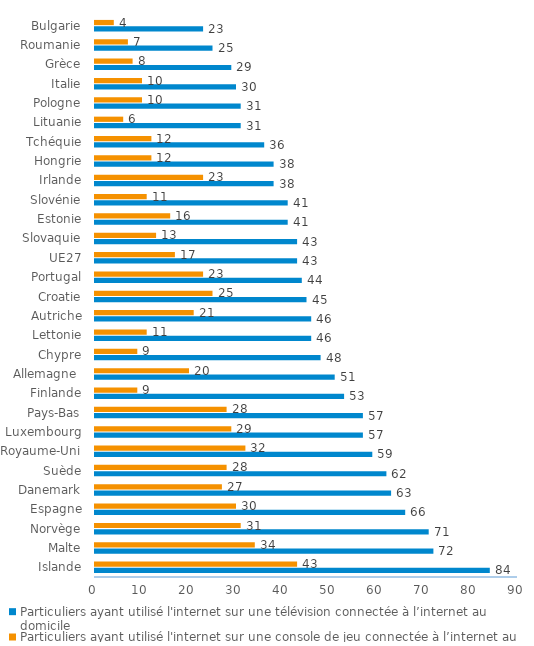
| Category | Particuliers ayant utilisé l'internet sur une télévision connectée à l’internet au domicile | Particuliers ayant utilisé l'internet sur une console de jeu connectée à l’internet au domicile |
|---|---|---|
| Islande | 84 | 43 |
| Malte | 72 | 34 |
| Norvège | 71 | 31 |
| Espagne | 66 | 30 |
| Danemark | 63 | 27 |
| Suède | 62 | 28 |
| Royaume-Uni | 59 | 32 |
| Luxembourg | 57 | 29 |
| Pays-Bas | 57 | 28 |
| Finlande | 53 | 9 |
| Allemagne  | 51 | 20 |
| Chypre | 48 | 9 |
| Lettonie | 46 | 11 |
| Autriche | 46 | 21 |
| Croatie | 45 | 25 |
| Portugal | 44 | 23 |
| UE27 | 43 | 17 |
| Slovaquie | 43 | 13 |
| Estonie | 41 | 16 |
| Slovénie | 41 | 11 |
| Irlande | 38 | 23 |
| Hongrie | 38 | 12 |
| Tchéquie | 36 | 12 |
| Lituanie | 31 | 6 |
| Pologne | 31 | 10 |
| Italie | 30 | 10 |
| Grèce | 29 | 8 |
| Roumanie | 25 | 7 |
| Bulgarie | 23 | 4 |